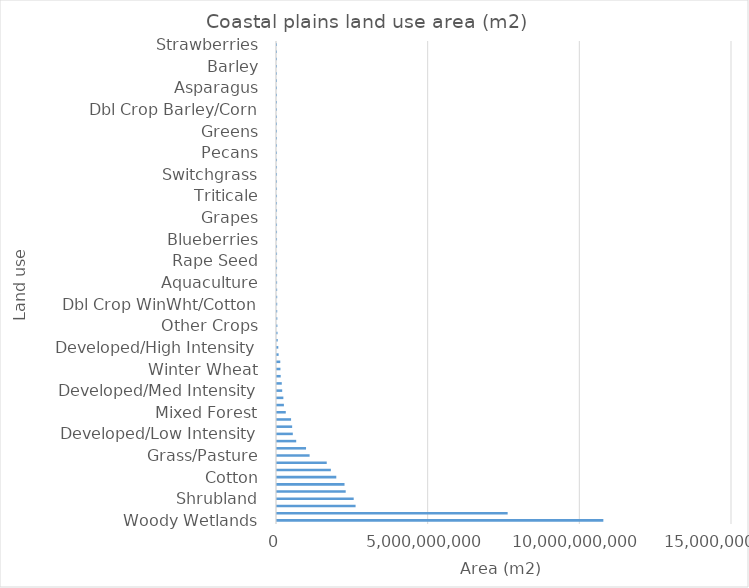
| Category | Coastal plains land use area (m2)  |
|---|---|
| Woody Wetlands | 10758755700 |
| Evergreen Forest | 7604031600 |
| Soybeans | 2590371900 |
| Shrubland | 2528525700 |
| Dbl Crop WinWht/Soybeans | 2265030000 |
| Corn | 2225946600 |
| Cotton | 1954584900 |
| Developed/Open Space | 1775494800 |
| Deciduous Forest | 1639851300 |
| Grass/Pasture | 1074919500 |
| Herbaceous Wetlands | 957212100 |
| Open Water | 632902500 |
| Developed/Low Intensity | 521363700 |
| Other Hay/Non Alfalfa | 499326300 |
| Fallow/Idle Cropland | 463551300 |
| Mixed Forest | 289344600 |
| Tobacco | 227556900 |
| Peanuts | 209657700 |
| Developed/Med Intensity | 171381600 |
| Sod/Grass Seed | 157935600 |
| Sorghum | 121965300 |
| Winter Wheat | 113300100 |
| Barren | 107739900 |
| Sweet Potatoes | 53750700 |
| Developed/High Intensity | 42924600 |
| Herbs | 23958000 |
| Dbl Crop WinWht/Sorghum | 17104500 |
| Other Crops | 12213900 |
| Millet | 10932300 |
| Potatoes | 6989400 |
| Dbl Crop WinWht/Cotton | 6809400 |
| Dbl Crop Soybeans/Oats | 6209100 |
| Rye | 4787100 |
| Aquaculture | 3654000 |
| Oats | 2763900 |
| Dbl Crop WinWht/Corn | 2098800 |
| Rape Seed | 1988100 |
| Watermelons | 1734300 |
| Peppers | 1479600 |
| Blueberries | 1220400 |
| Cucumbers | 1179000 |
| Dbl Crop Barley/Soybeans | 1118700 |
| Grapes | 936000 |
| Dry Beans | 785700 |
| Sweet Corn | 744300 |
| Triticale | 693900 |
| Dbl Crop Soybeans/Cotton | 673200 |
| Squash | 561600 |
| Switchgrass | 534600 |
| Peaches | 496800 |
| Sunflower | 367200 |
| Pecans | 305100 |
| Alfalfa | 155700 |
| Pumpkins | 128700 |
| Greens | 120600 |
| Cabbage | 82800 |
| Dbl Crop Oats/Corn | 62100 |
| Dbl Crop Barley/Corn | 36900 |
| Tomatoes | 30600 |
| Peas | 27900 |
| Asparagus | 22500 |
| Dbl Crop Corn/Soybeans | 20700 |
| Onions | 14400 |
| Barley | 9900 |
| Canola | 1800 |
| Flaxseed | 900 |
| Strawberries | 900 |